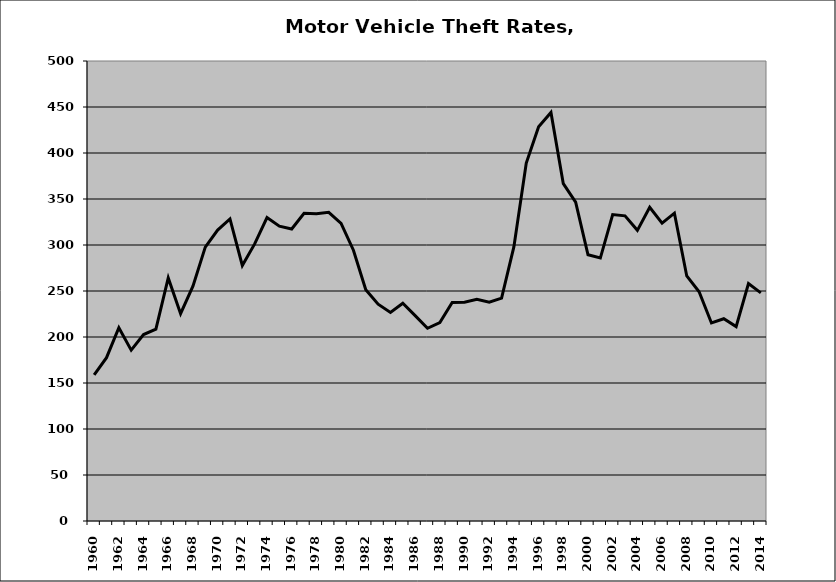
| Category | Motor Vehicle |
|---|---|
| 1960.0 | 158.765 |
| 1961.0 | 177.511 |
| 1962.0 | 210.031 |
| 1963.0 | 185.758 |
| 1964.0 | 202.621 |
| 1965.0 | 208.485 |
| 1966.0 | 264.187 |
| 1967.0 | 225.293 |
| 1968.0 | 255.222 |
| 1969.0 | 297.703 |
| 1970.0 | 316.255 |
| 1971.0 | 328.298 |
| 1972.0 | 277.709 |
| 1973.0 | 301.21 |
| 1974.0 | 329.838 |
| 1975.0 | 320.481 |
| 1976.0 | 317.345 |
| 1977.0 | 334.464 |
| 1978.0 | 333.894 |
| 1979.0 | 335.552 |
| 1980.0 | 323.569 |
| 1981.0 | 294.327 |
| 1982.0 | 251.48 |
| 1983.0 | 235.701 |
| 1984.0 | 226.695 |
| 1985.0 | 236.657 |
| 1986.0 | 223.183 |
| 1987.0 | 209.464 |
| 1988.0 | 215.73 |
| 1989.0 | 237.61 |
| 1990.0 | 237.746 |
| 1991.0 | 240.96 |
| 1992.0 | 237.893 |
| 1993.0 | 242.204 |
| 1994.0 | 298.166 |
| 1995.0 | 389.134 |
| 1996.0 | 428.6 |
| 1997.0 | 444.099 |
| 1998.0 | 366.667 |
| 1999.0 | 346.599 |
| 2000.0 | 289.32 |
| 2001.0 | 285.819 |
| 2002.0 | 333.019 |
| 2003.0 | 331.701 |
| 2004.0 | 315.941 |
| 2005.0 | 341.039 |
| 2006.0 | 323.835 |
| 2007.0 | 334.665 |
| 2008.0 | 266.376 |
| 2009.0 | 249.123 |
| 2010.0 | 215.241 |
| 2011.0 | 219.838 |
| 2012.0 | 211.288 |
| 2013.0 | 258.097 |
| 2014.0 | 247.987 |